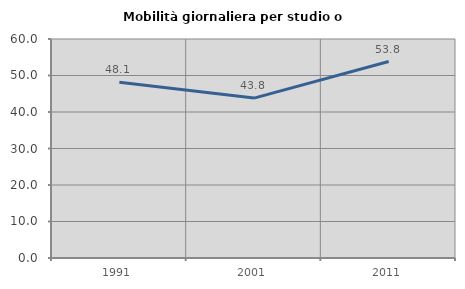
| Category | Mobilità giornaliera per studio o lavoro |
|---|---|
| 1991.0 | 48.13 |
| 2001.0 | 43.806 |
| 2011.0 | 53.825 |